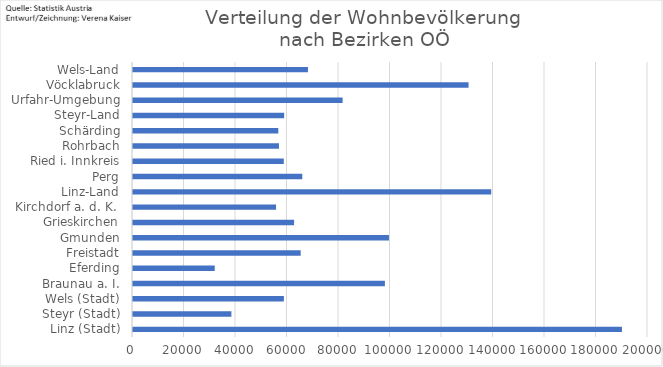
| Category | Series 0 |
|---|---|
| Linz (Stadt) | 189889 |
| Steyr (Stadt) | 38205 |
| Wels (Stadt) | 58591 |
| Braunau a. I. | 97826 |
| Eferding | 31741 |
| Freistadt | 65113 |
| Gmunden | 99403 |
| Grieskirchen | 62555 |
| Kirchdorf a. d. K.  | 55557 |
| Linz-Land | 139116 |
| Perg | 65738 |
| Ried i. Innkreis | 58553 |
| Rohrbach | 56688 |
| Schärding | 56426 |
| Steyr-Land | 58700 |
| Urfahr-Umgebung | 81400 |
| Vöcklabruck | 130316 |
| Wels-Land | 67945 |